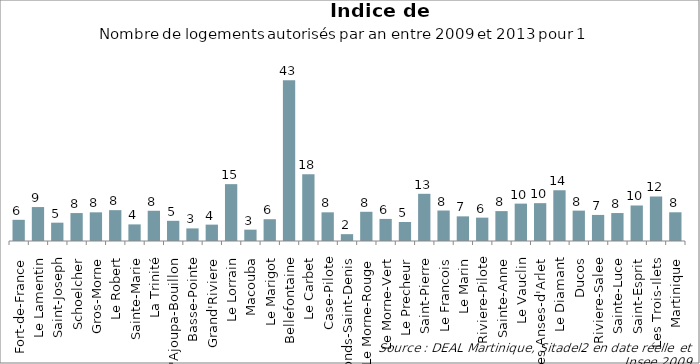
| Category | Series 0 |
|---|---|
| Fort-de-France | 5.724 |
| Le Lamentin | 9.177 |
| Saint-Joseph | 4.949 |
| Schoelcher | 7.551 |
| Gros-Morne | 7.748 |
| Le Robert | 8.337 |
| Sainte-Marie | 4.488 |
| La Trinité | 8.174 |
| L'Ajoupa-Bouillon | 5.456 |
| Basse-Pointe | 3.401 |
| Grand'Riviere | 4.425 |
| Le Lorrain | 15.366 |
| Macouba | 3.067 |
| Le Marigot | 5.887 |
| Bellefontaine | 43.46 |
| Le Carbet | 18.062 |
| Case-Pilote | 7.751 |
| Fonds-Saint-Denis | 1.85 |
| Le Morne-Rouge | 7.897 |
| Le Morne-Vert | 5.969 |
| Le Precheur | 5.14 |
| Saint-Pierre | 12.755 |
| Le Francois | 8.237 |
| Le Marin | 6.661 |
| Riviere-Pilote | 6.311 |
| Sainte-Anne | 8.08 |
| Le Vauclin | 10.102 |
| Les Anses-d'Arlet | 10.23 |
| Le Diamant | 13.717 |
| Ducos | 8.209 |
| Riviere-Salee | 7.045 |
| Sainte-Luce | 7.559 |
| Saint-Esprit | 9.597 |
| Les Trois-Ilets | 12.03 |
| Martinique | 7.759 |